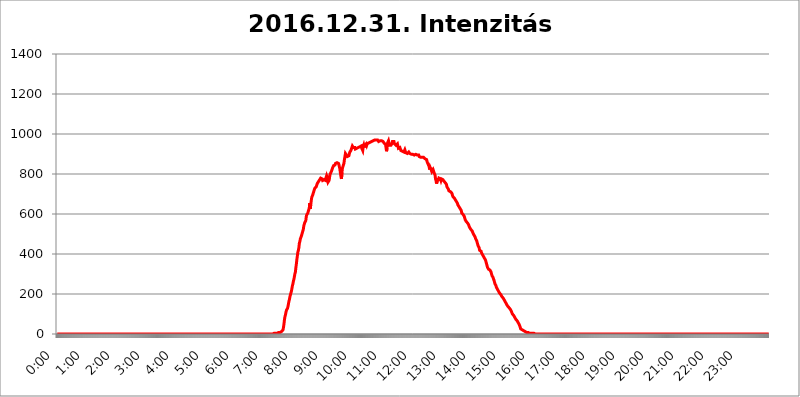
| Category | 2016.12.31. Intenzitás [W/m^2] |
|---|---|
| 0.0 | 0 |
| 0.0006944444444444445 | 0 |
| 0.001388888888888889 | 0 |
| 0.0020833333333333333 | 0 |
| 0.002777777777777778 | 0 |
| 0.003472222222222222 | 0 |
| 0.004166666666666667 | 0 |
| 0.004861111111111111 | 0 |
| 0.005555555555555556 | 0 |
| 0.0062499999999999995 | 0 |
| 0.006944444444444444 | 0 |
| 0.007638888888888889 | 0 |
| 0.008333333333333333 | 0 |
| 0.009027777777777779 | 0 |
| 0.009722222222222222 | 0 |
| 0.010416666666666666 | 0 |
| 0.011111111111111112 | 0 |
| 0.011805555555555555 | 0 |
| 0.012499999999999999 | 0 |
| 0.013194444444444444 | 0 |
| 0.013888888888888888 | 0 |
| 0.014583333333333332 | 0 |
| 0.015277777777777777 | 0 |
| 0.015972222222222224 | 0 |
| 0.016666666666666666 | 0 |
| 0.017361111111111112 | 0 |
| 0.018055555555555557 | 0 |
| 0.01875 | 0 |
| 0.019444444444444445 | 0 |
| 0.02013888888888889 | 0 |
| 0.020833333333333332 | 0 |
| 0.02152777777777778 | 0 |
| 0.022222222222222223 | 0 |
| 0.02291666666666667 | 0 |
| 0.02361111111111111 | 0 |
| 0.024305555555555556 | 0 |
| 0.024999999999999998 | 0 |
| 0.025694444444444447 | 0 |
| 0.02638888888888889 | 0 |
| 0.027083333333333334 | 0 |
| 0.027777777777777776 | 0 |
| 0.02847222222222222 | 0 |
| 0.029166666666666664 | 0 |
| 0.029861111111111113 | 0 |
| 0.030555555555555555 | 0 |
| 0.03125 | 0 |
| 0.03194444444444445 | 0 |
| 0.03263888888888889 | 0 |
| 0.03333333333333333 | 0 |
| 0.034027777777777775 | 0 |
| 0.034722222222222224 | 0 |
| 0.035416666666666666 | 0 |
| 0.036111111111111115 | 0 |
| 0.03680555555555556 | 0 |
| 0.0375 | 0 |
| 0.03819444444444444 | 0 |
| 0.03888888888888889 | 0 |
| 0.03958333333333333 | 0 |
| 0.04027777777777778 | 0 |
| 0.04097222222222222 | 0 |
| 0.041666666666666664 | 0 |
| 0.042361111111111106 | 0 |
| 0.04305555555555556 | 0 |
| 0.043750000000000004 | 0 |
| 0.044444444444444446 | 0 |
| 0.04513888888888889 | 0 |
| 0.04583333333333334 | 0 |
| 0.04652777777777778 | 0 |
| 0.04722222222222222 | 0 |
| 0.04791666666666666 | 0 |
| 0.04861111111111111 | 0 |
| 0.049305555555555554 | 0 |
| 0.049999999999999996 | 0 |
| 0.05069444444444445 | 0 |
| 0.051388888888888894 | 0 |
| 0.052083333333333336 | 0 |
| 0.05277777777777778 | 0 |
| 0.05347222222222222 | 0 |
| 0.05416666666666667 | 0 |
| 0.05486111111111111 | 0 |
| 0.05555555555555555 | 0 |
| 0.05625 | 0 |
| 0.05694444444444444 | 0 |
| 0.057638888888888885 | 0 |
| 0.05833333333333333 | 0 |
| 0.05902777777777778 | 0 |
| 0.059722222222222225 | 0 |
| 0.06041666666666667 | 0 |
| 0.061111111111111116 | 0 |
| 0.06180555555555556 | 0 |
| 0.0625 | 0 |
| 0.06319444444444444 | 0 |
| 0.06388888888888888 | 0 |
| 0.06458333333333334 | 0 |
| 0.06527777777777778 | 0 |
| 0.06597222222222222 | 0 |
| 0.06666666666666667 | 0 |
| 0.06736111111111111 | 0 |
| 0.06805555555555555 | 0 |
| 0.06874999999999999 | 0 |
| 0.06944444444444443 | 0 |
| 0.07013888888888889 | 0 |
| 0.07083333333333333 | 0 |
| 0.07152777777777779 | 0 |
| 0.07222222222222223 | 0 |
| 0.07291666666666667 | 0 |
| 0.07361111111111111 | 0 |
| 0.07430555555555556 | 0 |
| 0.075 | 0 |
| 0.07569444444444444 | 0 |
| 0.0763888888888889 | 0 |
| 0.07708333333333334 | 0 |
| 0.07777777777777778 | 0 |
| 0.07847222222222222 | 0 |
| 0.07916666666666666 | 0 |
| 0.0798611111111111 | 0 |
| 0.08055555555555556 | 0 |
| 0.08125 | 0 |
| 0.08194444444444444 | 0 |
| 0.08263888888888889 | 0 |
| 0.08333333333333333 | 0 |
| 0.08402777777777777 | 0 |
| 0.08472222222222221 | 0 |
| 0.08541666666666665 | 0 |
| 0.08611111111111112 | 0 |
| 0.08680555555555557 | 0 |
| 0.08750000000000001 | 0 |
| 0.08819444444444445 | 0 |
| 0.08888888888888889 | 0 |
| 0.08958333333333333 | 0 |
| 0.09027777777777778 | 0 |
| 0.09097222222222222 | 0 |
| 0.09166666666666667 | 0 |
| 0.09236111111111112 | 0 |
| 0.09305555555555556 | 0 |
| 0.09375 | 0 |
| 0.09444444444444444 | 0 |
| 0.09513888888888888 | 0 |
| 0.09583333333333333 | 0 |
| 0.09652777777777777 | 0 |
| 0.09722222222222222 | 0 |
| 0.09791666666666667 | 0 |
| 0.09861111111111111 | 0 |
| 0.09930555555555555 | 0 |
| 0.09999999999999999 | 0 |
| 0.10069444444444443 | 0 |
| 0.1013888888888889 | 0 |
| 0.10208333333333335 | 0 |
| 0.10277777777777779 | 0 |
| 0.10347222222222223 | 0 |
| 0.10416666666666667 | 0 |
| 0.10486111111111111 | 0 |
| 0.10555555555555556 | 0 |
| 0.10625 | 0 |
| 0.10694444444444444 | 0 |
| 0.1076388888888889 | 0 |
| 0.10833333333333334 | 0 |
| 0.10902777777777778 | 0 |
| 0.10972222222222222 | 0 |
| 0.1111111111111111 | 0 |
| 0.11180555555555556 | 0 |
| 0.11180555555555556 | 0 |
| 0.1125 | 0 |
| 0.11319444444444444 | 0 |
| 0.11388888888888889 | 0 |
| 0.11458333333333333 | 0 |
| 0.11527777777777777 | 0 |
| 0.11597222222222221 | 0 |
| 0.11666666666666665 | 0 |
| 0.1173611111111111 | 0 |
| 0.11805555555555557 | 0 |
| 0.11944444444444445 | 0 |
| 0.12013888888888889 | 0 |
| 0.12083333333333333 | 0 |
| 0.12152777777777778 | 0 |
| 0.12222222222222223 | 0 |
| 0.12291666666666667 | 0 |
| 0.12291666666666667 | 0 |
| 0.12361111111111112 | 0 |
| 0.12430555555555556 | 0 |
| 0.125 | 0 |
| 0.12569444444444444 | 0 |
| 0.12638888888888888 | 0 |
| 0.12708333333333333 | 0 |
| 0.16875 | 0 |
| 0.12847222222222224 | 0 |
| 0.12916666666666668 | 0 |
| 0.12986111111111112 | 0 |
| 0.13055555555555556 | 0 |
| 0.13125 | 0 |
| 0.13194444444444445 | 0 |
| 0.1326388888888889 | 0 |
| 0.13333333333333333 | 0 |
| 0.13402777777777777 | 0 |
| 0.13402777777777777 | 0 |
| 0.13472222222222222 | 0 |
| 0.13541666666666666 | 0 |
| 0.1361111111111111 | 0 |
| 0.13749999999999998 | 0 |
| 0.13819444444444443 | 0 |
| 0.1388888888888889 | 0 |
| 0.13958333333333334 | 0 |
| 0.14027777777777778 | 0 |
| 0.14097222222222222 | 0 |
| 0.14166666666666666 | 0 |
| 0.1423611111111111 | 0 |
| 0.14305555555555557 | 0 |
| 0.14375000000000002 | 0 |
| 0.14444444444444446 | 0 |
| 0.1451388888888889 | 0 |
| 0.1451388888888889 | 0 |
| 0.14652777777777778 | 0 |
| 0.14722222222222223 | 0 |
| 0.14791666666666667 | 0 |
| 0.1486111111111111 | 0 |
| 0.14930555555555555 | 0 |
| 0.15 | 0 |
| 0.15069444444444444 | 0 |
| 0.15138888888888888 | 0 |
| 0.15208333333333332 | 0 |
| 0.15277777777777776 | 0 |
| 0.15347222222222223 | 0 |
| 0.15416666666666667 | 0 |
| 0.15486111111111112 | 0 |
| 0.15555555555555556 | 0 |
| 0.15625 | 0 |
| 0.15694444444444444 | 0 |
| 0.15763888888888888 | 0 |
| 0.15833333333333333 | 0 |
| 0.15902777777777777 | 0 |
| 0.15972222222222224 | 0 |
| 0.16041666666666668 | 0 |
| 0.16111111111111112 | 0 |
| 0.16180555555555556 | 0 |
| 0.1625 | 0 |
| 0.16319444444444445 | 0 |
| 0.1638888888888889 | 0 |
| 0.16458333333333333 | 0 |
| 0.16527777777777777 | 0 |
| 0.16597222222222222 | 0 |
| 0.16666666666666666 | 0 |
| 0.1673611111111111 | 0 |
| 0.16805555555555554 | 0 |
| 0.16874999999999998 | 0 |
| 0.16944444444444443 | 0 |
| 0.17013888888888887 | 0 |
| 0.1708333333333333 | 0 |
| 0.17152777777777775 | 0 |
| 0.17222222222222225 | 0 |
| 0.1729166666666667 | 0 |
| 0.17361111111111113 | 0 |
| 0.17430555555555557 | 0 |
| 0.17500000000000002 | 0 |
| 0.17569444444444446 | 0 |
| 0.1763888888888889 | 0 |
| 0.17708333333333334 | 0 |
| 0.17777777777777778 | 0 |
| 0.17847222222222223 | 0 |
| 0.17916666666666667 | 0 |
| 0.1798611111111111 | 0 |
| 0.18055555555555555 | 0 |
| 0.18125 | 0 |
| 0.18194444444444444 | 0 |
| 0.1826388888888889 | 0 |
| 0.18333333333333335 | 0 |
| 0.1840277777777778 | 0 |
| 0.18472222222222223 | 0 |
| 0.18541666666666667 | 0 |
| 0.18611111111111112 | 0 |
| 0.18680555555555556 | 0 |
| 0.1875 | 0 |
| 0.18819444444444444 | 0 |
| 0.18888888888888888 | 0 |
| 0.18958333333333333 | 0 |
| 0.19027777777777777 | 0 |
| 0.1909722222222222 | 0 |
| 0.19166666666666665 | 0 |
| 0.19236111111111112 | 0 |
| 0.19305555555555554 | 0 |
| 0.19375 | 0 |
| 0.19444444444444445 | 0 |
| 0.1951388888888889 | 0 |
| 0.19583333333333333 | 0 |
| 0.19652777777777777 | 0 |
| 0.19722222222222222 | 0 |
| 0.19791666666666666 | 0 |
| 0.1986111111111111 | 0 |
| 0.19930555555555554 | 0 |
| 0.19999999999999998 | 0 |
| 0.20069444444444443 | 0 |
| 0.20138888888888887 | 0 |
| 0.2020833333333333 | 0 |
| 0.2027777777777778 | 0 |
| 0.2034722222222222 | 0 |
| 0.2041666666666667 | 0 |
| 0.20486111111111113 | 0 |
| 0.20555555555555557 | 0 |
| 0.20625000000000002 | 0 |
| 0.20694444444444446 | 0 |
| 0.2076388888888889 | 0 |
| 0.20833333333333334 | 0 |
| 0.20902777777777778 | 0 |
| 0.20972222222222223 | 0 |
| 0.21041666666666667 | 0 |
| 0.2111111111111111 | 0 |
| 0.21180555555555555 | 0 |
| 0.2125 | 0 |
| 0.21319444444444444 | 0 |
| 0.2138888888888889 | 0 |
| 0.21458333333333335 | 0 |
| 0.2152777777777778 | 0 |
| 0.21597222222222223 | 0 |
| 0.21666666666666667 | 0 |
| 0.21736111111111112 | 0 |
| 0.21805555555555556 | 0 |
| 0.21875 | 0 |
| 0.21944444444444444 | 0 |
| 0.22013888888888888 | 0 |
| 0.22083333333333333 | 0 |
| 0.22152777777777777 | 0 |
| 0.2222222222222222 | 0 |
| 0.22291666666666665 | 0 |
| 0.2236111111111111 | 0 |
| 0.22430555555555556 | 0 |
| 0.225 | 0 |
| 0.22569444444444445 | 0 |
| 0.2263888888888889 | 0 |
| 0.22708333333333333 | 0 |
| 0.22777777777777777 | 0 |
| 0.22847222222222222 | 0 |
| 0.22916666666666666 | 0 |
| 0.2298611111111111 | 0 |
| 0.23055555555555554 | 0 |
| 0.23124999999999998 | 0 |
| 0.23194444444444443 | 0 |
| 0.23263888888888887 | 0 |
| 0.2333333333333333 | 0 |
| 0.2340277777777778 | 0 |
| 0.2347222222222222 | 0 |
| 0.2354166666666667 | 0 |
| 0.23611111111111113 | 0 |
| 0.23680555555555557 | 0 |
| 0.23750000000000002 | 0 |
| 0.23819444444444446 | 0 |
| 0.2388888888888889 | 0 |
| 0.23958333333333334 | 0 |
| 0.24027777777777778 | 0 |
| 0.24097222222222223 | 0 |
| 0.24166666666666667 | 0 |
| 0.2423611111111111 | 0 |
| 0.24305555555555555 | 0 |
| 0.24375 | 0 |
| 0.24444444444444446 | 0 |
| 0.24513888888888888 | 0 |
| 0.24583333333333335 | 0 |
| 0.2465277777777778 | 0 |
| 0.24722222222222223 | 0 |
| 0.24791666666666667 | 0 |
| 0.24861111111111112 | 0 |
| 0.24930555555555556 | 0 |
| 0.25 | 0 |
| 0.25069444444444444 | 0 |
| 0.2513888888888889 | 0 |
| 0.2520833333333333 | 0 |
| 0.25277777777777777 | 0 |
| 0.2534722222222222 | 0 |
| 0.25416666666666665 | 0 |
| 0.2548611111111111 | 0 |
| 0.2555555555555556 | 0 |
| 0.25625000000000003 | 0 |
| 0.2569444444444445 | 0 |
| 0.2576388888888889 | 0 |
| 0.25833333333333336 | 0 |
| 0.2590277777777778 | 0 |
| 0.25972222222222224 | 0 |
| 0.2604166666666667 | 0 |
| 0.2611111111111111 | 0 |
| 0.26180555555555557 | 0 |
| 0.2625 | 0 |
| 0.26319444444444445 | 0 |
| 0.2638888888888889 | 0 |
| 0.26458333333333334 | 0 |
| 0.2652777777777778 | 0 |
| 0.2659722222222222 | 0 |
| 0.26666666666666666 | 0 |
| 0.2673611111111111 | 0 |
| 0.26805555555555555 | 0 |
| 0.26875 | 0 |
| 0.26944444444444443 | 0 |
| 0.2701388888888889 | 0 |
| 0.2708333333333333 | 0 |
| 0.27152777777777776 | 0 |
| 0.2722222222222222 | 0 |
| 0.27291666666666664 | 0 |
| 0.2736111111111111 | 0 |
| 0.2743055555555555 | 0 |
| 0.27499999999999997 | 0 |
| 0.27569444444444446 | 0 |
| 0.27638888888888885 | 0 |
| 0.27708333333333335 | 0 |
| 0.2777777777777778 | 0 |
| 0.27847222222222223 | 0 |
| 0.2791666666666667 | 0 |
| 0.2798611111111111 | 0 |
| 0.28055555555555556 | 0 |
| 0.28125 | 0 |
| 0.28194444444444444 | 0 |
| 0.2826388888888889 | 0 |
| 0.2833333333333333 | 0 |
| 0.28402777777777777 | 0 |
| 0.2847222222222222 | 0 |
| 0.28541666666666665 | 0 |
| 0.28611111111111115 | 0 |
| 0.28680555555555554 | 0 |
| 0.28750000000000003 | 0 |
| 0.2881944444444445 | 0 |
| 0.2888888888888889 | 0 |
| 0.28958333333333336 | 0 |
| 0.2902777777777778 | 0 |
| 0.29097222222222224 | 0 |
| 0.2916666666666667 | 0 |
| 0.2923611111111111 | 0 |
| 0.29305555555555557 | 0 |
| 0.29375 | 0 |
| 0.29444444444444445 | 0 |
| 0.2951388888888889 | 0 |
| 0.29583333333333334 | 0 |
| 0.2965277777777778 | 0 |
| 0.2972222222222222 | 0 |
| 0.29791666666666666 | 0 |
| 0.2986111111111111 | 0 |
| 0.29930555555555555 | 0 |
| 0.3 | 0 |
| 0.30069444444444443 | 0 |
| 0.3013888888888889 | 0 |
| 0.3020833333333333 | 0 |
| 0.30277777777777776 | 0 |
| 0.3034722222222222 | 0 |
| 0.30416666666666664 | 3.525 |
| 0.3048611111111111 | 3.525 |
| 0.3055555555555555 | 3.525 |
| 0.30624999999999997 | 3.525 |
| 0.3069444444444444 | 3.525 |
| 0.3076388888888889 | 3.525 |
| 0.30833333333333335 | 3.525 |
| 0.3090277777777778 | 3.525 |
| 0.30972222222222223 | 3.525 |
| 0.3104166666666667 | 7.887 |
| 0.3111111111111111 | 7.887 |
| 0.31180555555555556 | 7.887 |
| 0.3125 | 7.887 |
| 0.31319444444444444 | 7.887 |
| 0.3138888888888889 | 12.257 |
| 0.3145833333333333 | 12.257 |
| 0.31527777777777777 | 12.257 |
| 0.3159722222222222 | 16.636 |
| 0.31666666666666665 | 21.024 |
| 0.31736111111111115 | 34.234 |
| 0.31805555555555554 | 51.951 |
| 0.31875000000000003 | 74.246 |
| 0.3194444444444445 | 87.692 |
| 0.3201388888888889 | 96.682 |
| 0.32083333333333336 | 110.201 |
| 0.3215277777777778 | 119.235 |
| 0.32222222222222224 | 123.758 |
| 0.3229166666666667 | 128.284 |
| 0.3236111111111111 | 137.347 |
| 0.32430555555555557 | 150.964 |
| 0.325 | 164.605 |
| 0.32569444444444445 | 173.709 |
| 0.3263888888888889 | 187.378 |
| 0.32708333333333334 | 196.497 |
| 0.3277777777777778 | 205.62 |
| 0.3284722222222222 | 214.746 |
| 0.32916666666666666 | 228.436 |
| 0.3298611111111111 | 242.127 |
| 0.33055555555555555 | 251.251 |
| 0.33125 | 264.932 |
| 0.33194444444444443 | 274.047 |
| 0.3326388888888889 | 287.709 |
| 0.3333333333333333 | 301.354 |
| 0.3340277777777778 | 310.44 |
| 0.3347222222222222 | 333.113 |
| 0.3354166666666667 | 351.198 |
| 0.3361111111111111 | 373.729 |
| 0.3368055555555556 | 391.685 |
| 0.33749999999999997 | 409.574 |
| 0.33819444444444446 | 418.492 |
| 0.33888888888888885 | 431.833 |
| 0.33958333333333335 | 453.968 |
| 0.34027777777777773 | 462.786 |
| 0.34097222222222223 | 475.972 |
| 0.3416666666666666 | 480.356 |
| 0.3423611111111111 | 489.108 |
| 0.3430555555555555 | 493.475 |
| 0.34375 | 506.542 |
| 0.3444444444444445 | 510.885 |
| 0.3451388888888889 | 523.88 |
| 0.3458333333333334 | 541.121 |
| 0.34652777777777777 | 549.704 |
| 0.34722222222222227 | 558.261 |
| 0.34791666666666665 | 558.261 |
| 0.34861111111111115 | 566.793 |
| 0.34930555555555554 | 588.009 |
| 0.35000000000000003 | 596.45 |
| 0.3506944444444444 | 600.661 |
| 0.3513888888888889 | 604.864 |
| 0.3520833333333333 | 609.062 |
| 0.3527777777777778 | 621.613 |
| 0.3534722222222222 | 629.948 |
| 0.3541666666666667 | 654.791 |
| 0.3548611111111111 | 625.784 |
| 0.35555555555555557 | 646.537 |
| 0.35625 | 667.123 |
| 0.35694444444444445 | 683.473 |
| 0.3576388888888889 | 687.544 |
| 0.35833333333333334 | 695.666 |
| 0.3590277777777778 | 703.762 |
| 0.3597222222222222 | 711.832 |
| 0.36041666666666666 | 719.877 |
| 0.3611111111111111 | 727.896 |
| 0.36180555555555555 | 727.896 |
| 0.3625 | 727.896 |
| 0.36319444444444443 | 735.89 |
| 0.3638888888888889 | 739.877 |
| 0.3645833333333333 | 751.803 |
| 0.3652777777777778 | 755.766 |
| 0.3659722222222222 | 755.766 |
| 0.3666666666666667 | 763.674 |
| 0.3673611111111111 | 767.62 |
| 0.3680555555555556 | 771.559 |
| 0.36874999999999997 | 775.492 |
| 0.36944444444444446 | 779.42 |
| 0.37013888888888885 | 779.42 |
| 0.37083333333333335 | 783.342 |
| 0.37152777777777773 | 775.492 |
| 0.37222222222222223 | 767.62 |
| 0.3729166666666666 | 763.674 |
| 0.3736111111111111 | 767.62 |
| 0.3743055555555555 | 771.559 |
| 0.375 | 775.492 |
| 0.3756944444444445 | 767.62 |
| 0.3763888888888889 | 767.62 |
| 0.3770833333333334 | 783.342 |
| 0.37777777777777777 | 791.169 |
| 0.37847222222222227 | 787.258 |
| 0.37916666666666665 | 775.492 |
| 0.37986111111111115 | 759.723 |
| 0.38055555555555554 | 759.723 |
| 0.38125000000000003 | 767.62 |
| 0.3819444444444444 | 783.342 |
| 0.3826388888888889 | 798.974 |
| 0.3833333333333333 | 795.074 |
| 0.3840277777777778 | 802.868 |
| 0.3847222222222222 | 814.519 |
| 0.3854166666666667 | 822.26 |
| 0.3861111111111111 | 829.981 |
| 0.38680555555555557 | 833.834 |
| 0.3875 | 841.526 |
| 0.38819444444444445 | 845.365 |
| 0.3888888888888889 | 845.365 |
| 0.38958333333333334 | 845.365 |
| 0.3902777777777778 | 853.029 |
| 0.3909722222222222 | 853.029 |
| 0.39166666666666666 | 856.855 |
| 0.3923611111111111 | 856.855 |
| 0.39305555555555555 | 860.676 |
| 0.39375 | 860.676 |
| 0.39444444444444443 | 853.029 |
| 0.3951388888888889 | 845.365 |
| 0.3958333333333333 | 833.834 |
| 0.3965277777777778 | 822.26 |
| 0.3972222222222222 | 802.868 |
| 0.3979166666666667 | 787.258 |
| 0.3986111111111111 | 775.492 |
| 0.3993055555555556 | 806.757 |
| 0.39999999999999997 | 829.981 |
| 0.40069444444444446 | 833.834 |
| 0.40138888888888885 | 845.365 |
| 0.40208333333333335 | 853.029 |
| 0.40277777777777773 | 872.114 |
| 0.40347222222222223 | 887.309 |
| 0.4041666666666666 | 902.447 |
| 0.4048611111111111 | 902.447 |
| 0.4055555555555555 | 894.885 |
| 0.40625 | 894.885 |
| 0.4069444444444445 | 887.309 |
| 0.4076388888888889 | 887.309 |
| 0.4083333333333334 | 887.309 |
| 0.40902777777777777 | 891.099 |
| 0.40972222222222227 | 902.447 |
| 0.41041666666666665 | 909.996 |
| 0.41111111111111115 | 909.996 |
| 0.41180555555555554 | 917.534 |
| 0.41250000000000003 | 925.06 |
| 0.4131944444444444 | 932.576 |
| 0.4138888888888889 | 940.082 |
| 0.4145833333333333 | 936.33 |
| 0.4152777777777778 | 932.576 |
| 0.4159722222222222 | 928.819 |
| 0.4166666666666667 | 928.819 |
| 0.4173611111111111 | 932.576 |
| 0.41805555555555557 | 925.06 |
| 0.41875 | 921.298 |
| 0.41944444444444445 | 925.06 |
| 0.4201388888888889 | 928.819 |
| 0.42083333333333334 | 932.576 |
| 0.4215277777777778 | 932.576 |
| 0.4222222222222222 | 932.576 |
| 0.42291666666666666 | 936.33 |
| 0.4236111111111111 | 936.33 |
| 0.42430555555555555 | 936.33 |
| 0.425 | 940.082 |
| 0.42569444444444443 | 940.082 |
| 0.4263888888888889 | 940.082 |
| 0.4270833333333333 | 928.819 |
| 0.4277777777777778 | 928.819 |
| 0.4284722222222222 | 917.534 |
| 0.4291666666666667 | 936.33 |
| 0.4298611111111111 | 943.832 |
| 0.4305555555555556 | 932.576 |
| 0.43124999999999997 | 943.832 |
| 0.43194444444444446 | 943.832 |
| 0.43263888888888885 | 947.58 |
| 0.43333333333333335 | 951.327 |
| 0.43402777777777773 | 943.832 |
| 0.43472222222222223 | 951.327 |
| 0.4354166666666666 | 951.327 |
| 0.4361111111111111 | 951.327 |
| 0.4368055555555555 | 955.071 |
| 0.4375 | 955.071 |
| 0.4381944444444445 | 958.814 |
| 0.4388888888888889 | 958.814 |
| 0.4395833333333334 | 962.555 |
| 0.44027777777777777 | 958.814 |
| 0.44097222222222227 | 962.555 |
| 0.44166666666666665 | 958.814 |
| 0.44236111111111115 | 966.295 |
| 0.44305555555555554 | 966.295 |
| 0.44375000000000003 | 966.295 |
| 0.4444444444444444 | 966.295 |
| 0.4451388888888889 | 970.034 |
| 0.4458333333333333 | 973.772 |
| 0.4465277777777778 | 973.772 |
| 0.4472222222222222 | 970.034 |
| 0.4479166666666667 | 970.034 |
| 0.4486111111111111 | 966.295 |
| 0.44930555555555557 | 970.034 |
| 0.45 | 970.034 |
| 0.45069444444444445 | 962.555 |
| 0.4513888888888889 | 958.814 |
| 0.45208333333333334 | 962.555 |
| 0.4527777777777778 | 966.295 |
| 0.4534722222222222 | 962.555 |
| 0.45416666666666666 | 962.555 |
| 0.4548611111111111 | 966.295 |
| 0.45555555555555555 | 966.295 |
| 0.45625 | 962.555 |
| 0.45694444444444443 | 962.555 |
| 0.4576388888888889 | 958.814 |
| 0.4583333333333333 | 955.071 |
| 0.4590277777777778 | 958.814 |
| 0.4597222222222222 | 951.327 |
| 0.4604166666666667 | 947.58 |
| 0.4611111111111111 | 932.576 |
| 0.4618055555555556 | 913.766 |
| 0.46249999999999997 | 928.819 |
| 0.46319444444444446 | 955.071 |
| 0.46388888888888885 | 958.814 |
| 0.46458333333333335 | 966.295 |
| 0.46527777777777773 | 962.555 |
| 0.46597222222222223 | 943.832 |
| 0.4666666666666666 | 947.58 |
| 0.4673611111111111 | 943.832 |
| 0.4680555555555555 | 943.832 |
| 0.46875 | 943.832 |
| 0.4694444444444445 | 951.327 |
| 0.4701388888888889 | 962.555 |
| 0.4708333333333334 | 958.814 |
| 0.47152777777777777 | 966.295 |
| 0.47222222222222227 | 962.555 |
| 0.47291666666666665 | 951.327 |
| 0.47361111111111115 | 955.071 |
| 0.47430555555555554 | 955.071 |
| 0.47500000000000003 | 943.832 |
| 0.4756944444444444 | 940.082 |
| 0.4763888888888889 | 943.832 |
| 0.4770833333333333 | 951.327 |
| 0.4777777777777778 | 940.082 |
| 0.4784722222222222 | 928.819 |
| 0.4791666666666667 | 932.576 |
| 0.4798611111111111 | 932.576 |
| 0.48055555555555557 | 932.576 |
| 0.48125 | 925.06 |
| 0.48194444444444445 | 917.534 |
| 0.4826388888888889 | 917.534 |
| 0.48333333333333334 | 921.298 |
| 0.4840277777777778 | 913.766 |
| 0.4847222222222222 | 909.996 |
| 0.48541666666666666 | 913.766 |
| 0.4861111111111111 | 909.996 |
| 0.48680555555555555 | 909.996 |
| 0.4875 | 921.298 |
| 0.48819444444444443 | 913.766 |
| 0.4888888888888889 | 906.223 |
| 0.4895833333333333 | 909.996 |
| 0.4902777777777778 | 906.223 |
| 0.4909722222222222 | 902.447 |
| 0.4916666666666667 | 902.447 |
| 0.4923611111111111 | 906.223 |
| 0.4930555555555556 | 909.996 |
| 0.49374999999999997 | 909.996 |
| 0.49444444444444446 | 902.447 |
| 0.49513888888888885 | 902.447 |
| 0.49583333333333335 | 902.447 |
| 0.49652777777777773 | 898.668 |
| 0.49722222222222223 | 898.668 |
| 0.4979166666666666 | 898.668 |
| 0.4986111111111111 | 898.668 |
| 0.4993055555555555 | 898.668 |
| 0.5 | 894.885 |
| 0.5006944444444444 | 894.885 |
| 0.5013888888888889 | 894.885 |
| 0.5020833333333333 | 894.885 |
| 0.5027777777777778 | 898.668 |
| 0.5034722222222222 | 894.885 |
| 0.5041666666666667 | 894.885 |
| 0.5048611111111111 | 894.885 |
| 0.5055555555555555 | 894.885 |
| 0.50625 | 894.885 |
| 0.5069444444444444 | 894.885 |
| 0.5076388888888889 | 887.309 |
| 0.5083333333333333 | 887.309 |
| 0.5090277777777777 | 883.516 |
| 0.5097222222222222 | 883.516 |
| 0.5104166666666666 | 883.516 |
| 0.5111111111111112 | 883.516 |
| 0.5118055555555555 | 883.516 |
| 0.5125000000000001 | 879.719 |
| 0.5131944444444444 | 883.516 |
| 0.513888888888889 | 883.516 |
| 0.5145833333333333 | 879.719 |
| 0.5152777777777778 | 879.719 |
| 0.5159722222222222 | 875.918 |
| 0.5166666666666667 | 872.114 |
| 0.517361111111111 | 872.114 |
| 0.5180555555555556 | 872.114 |
| 0.5187499999999999 | 860.676 |
| 0.5194444444444445 | 860.676 |
| 0.5201388888888888 | 849.199 |
| 0.5208333333333334 | 853.029 |
| 0.5215277777777778 | 837.682 |
| 0.5222222222222223 | 822.26 |
| 0.5229166666666667 | 833.834 |
| 0.5236111111111111 | 829.981 |
| 0.5243055555555556 | 822.26 |
| 0.525 | 829.981 |
| 0.5256944444444445 | 814.519 |
| 0.5263888888888889 | 810.641 |
| 0.5270833333333333 | 822.26 |
| 0.5277777777777778 | 818.392 |
| 0.5284722222222222 | 806.757 |
| 0.5291666666666667 | 806.757 |
| 0.5298611111111111 | 795.074 |
| 0.5305555555555556 | 775.492 |
| 0.53125 | 767.62 |
| 0.5319444444444444 | 751.803 |
| 0.5326388888888889 | 755.766 |
| 0.5333333333333333 | 771.559 |
| 0.5340277777777778 | 779.42 |
| 0.5347222222222222 | 767.62 |
| 0.5354166666666667 | 779.42 |
| 0.5361111111111111 | 783.342 |
| 0.5368055555555555 | 783.342 |
| 0.5375 | 775.492 |
| 0.5381944444444444 | 767.62 |
| 0.5388888888888889 | 775.492 |
| 0.5395833333333333 | 775.492 |
| 0.5402777777777777 | 775.492 |
| 0.5409722222222222 | 771.559 |
| 0.5416666666666666 | 771.559 |
| 0.5423611111111112 | 763.674 |
| 0.5430555555555555 | 763.674 |
| 0.5437500000000001 | 763.674 |
| 0.5444444444444444 | 755.766 |
| 0.545138888888889 | 755.766 |
| 0.5458333333333333 | 747.834 |
| 0.5465277777777778 | 735.89 |
| 0.5472222222222222 | 735.89 |
| 0.5479166666666667 | 735.89 |
| 0.548611111111111 | 723.889 |
| 0.5493055555555556 | 715.858 |
| 0.5499999999999999 | 711.832 |
| 0.5506944444444445 | 711.832 |
| 0.5513888888888888 | 711.832 |
| 0.5520833333333334 | 707.8 |
| 0.5527777777777778 | 707.8 |
| 0.5534722222222223 | 703.762 |
| 0.5541666666666667 | 695.666 |
| 0.5548611111111111 | 687.544 |
| 0.5555555555555556 | 691.608 |
| 0.55625 | 683.473 |
| 0.5569444444444445 | 679.395 |
| 0.5576388888888889 | 675.311 |
| 0.5583333333333333 | 675.311 |
| 0.5590277777777778 | 667.123 |
| 0.5597222222222222 | 663.019 |
| 0.5604166666666667 | 663.019 |
| 0.5611111111111111 | 654.791 |
| 0.5618055555555556 | 646.537 |
| 0.5625 | 642.4 |
| 0.5631944444444444 | 642.4 |
| 0.5638888888888889 | 634.105 |
| 0.5645833333333333 | 629.948 |
| 0.5652777777777778 | 625.784 |
| 0.5659722222222222 | 621.613 |
| 0.5666666666666667 | 617.436 |
| 0.5673611111111111 | 604.864 |
| 0.5680555555555555 | 600.661 |
| 0.56875 | 604.864 |
| 0.5694444444444444 | 596.45 |
| 0.5701388888888889 | 592.233 |
| 0.5708333333333333 | 588.009 |
| 0.5715277777777777 | 579.542 |
| 0.5722222222222222 | 571.049 |
| 0.5729166666666666 | 566.793 |
| 0.5736111111111112 | 562.53 |
| 0.5743055555555555 | 558.261 |
| 0.5750000000000001 | 558.261 |
| 0.5756944444444444 | 553.986 |
| 0.576388888888889 | 549.704 |
| 0.5770833333333333 | 545.416 |
| 0.5777777777777778 | 536.82 |
| 0.5784722222222222 | 532.513 |
| 0.5791666666666667 | 532.513 |
| 0.579861111111111 | 523.88 |
| 0.5805555555555556 | 523.88 |
| 0.5812499999999999 | 519.555 |
| 0.5819444444444445 | 515.223 |
| 0.5826388888888888 | 510.885 |
| 0.5833333333333334 | 502.192 |
| 0.5840277777777778 | 497.836 |
| 0.5847222222222223 | 493.475 |
| 0.5854166666666667 | 489.108 |
| 0.5861111111111111 | 484.735 |
| 0.5868055555555556 | 475.972 |
| 0.5875 | 471.582 |
| 0.5881944444444445 | 467.187 |
| 0.5888888888888889 | 462.786 |
| 0.5895833333333333 | 449.551 |
| 0.5902777777777778 | 440.702 |
| 0.5909722222222222 | 436.27 |
| 0.5916666666666667 | 431.833 |
| 0.5923611111111111 | 418.492 |
| 0.5930555555555556 | 418.492 |
| 0.59375 | 418.492 |
| 0.5944444444444444 | 414.035 |
| 0.5951388888888889 | 405.108 |
| 0.5958333333333333 | 405.108 |
| 0.5965277777777778 | 396.164 |
| 0.5972222222222222 | 391.685 |
| 0.5979166666666667 | 391.685 |
| 0.5986111111111111 | 382.715 |
| 0.5993055555555555 | 387.202 |
| 0.6 | 382.715 |
| 0.6006944444444444 | 369.23 |
| 0.6013888888888889 | 360.221 |
| 0.6020833333333333 | 351.198 |
| 0.6027777777777777 | 342.162 |
| 0.6034722222222222 | 333.113 |
| 0.6041666666666666 | 328.584 |
| 0.6048611111111112 | 324.052 |
| 0.6055555555555555 | 324.052 |
| 0.6062500000000001 | 324.052 |
| 0.6069444444444444 | 319.517 |
| 0.607638888888889 | 314.98 |
| 0.6083333333333333 | 310.44 |
| 0.6090277777777778 | 301.354 |
| 0.6097222222222222 | 292.259 |
| 0.6104166666666667 | 287.709 |
| 0.611111111111111 | 283.156 |
| 0.6118055555555556 | 278.603 |
| 0.6124999999999999 | 269.49 |
| 0.6131944444444445 | 260.373 |
| 0.6138888888888888 | 251.251 |
| 0.6145833333333334 | 246.689 |
| 0.6152777777777778 | 242.127 |
| 0.6159722222222223 | 233 |
| 0.6166666666666667 | 228.436 |
| 0.6173611111111111 | 223.873 |
| 0.6180555555555556 | 223.873 |
| 0.61875 | 214.746 |
| 0.6194444444444445 | 210.182 |
| 0.6201388888888889 | 205.62 |
| 0.6208333333333333 | 201.058 |
| 0.6215277777777778 | 201.058 |
| 0.6222222222222222 | 196.497 |
| 0.6229166666666667 | 191.937 |
| 0.6236111111111111 | 187.378 |
| 0.6243055555555556 | 182.82 |
| 0.625 | 182.82 |
| 0.6256944444444444 | 178.264 |
| 0.6263888888888889 | 173.709 |
| 0.6270833333333333 | 169.156 |
| 0.6277777777777778 | 164.605 |
| 0.6284722222222222 | 160.056 |
| 0.6291666666666667 | 155.509 |
| 0.6298611111111111 | 150.964 |
| 0.6305555555555555 | 146.423 |
| 0.63125 | 141.884 |
| 0.6319444444444444 | 137.347 |
| 0.6326388888888889 | 137.347 |
| 0.6333333333333333 | 132.814 |
| 0.6340277777777777 | 128.284 |
| 0.6347222222222222 | 128.284 |
| 0.6354166666666666 | 123.758 |
| 0.6361111111111112 | 119.235 |
| 0.6368055555555555 | 114.716 |
| 0.6375000000000001 | 110.201 |
| 0.6381944444444444 | 101.184 |
| 0.638888888888889 | 101.184 |
| 0.6395833333333333 | 96.682 |
| 0.6402777777777778 | 92.184 |
| 0.6409722222222222 | 87.692 |
| 0.6416666666666667 | 83.205 |
| 0.642361111111111 | 78.722 |
| 0.6430555555555556 | 74.246 |
| 0.6437499999999999 | 74.246 |
| 0.6444444444444445 | 69.775 |
| 0.6451388888888888 | 65.31 |
| 0.6458333333333334 | 60.85 |
| 0.6465277777777778 | 56.398 |
| 0.6472222222222223 | 51.951 |
| 0.6479166666666667 | 47.511 |
| 0.6486111111111111 | 43.079 |
| 0.6493055555555556 | 34.234 |
| 0.65 | 25.419 |
| 0.6506944444444445 | 21.024 |
| 0.6513888888888889 | 21.024 |
| 0.6520833333333333 | 21.024 |
| 0.6527777777777778 | 21.024 |
| 0.6534722222222222 | 16.636 |
| 0.6541666666666667 | 16.636 |
| 0.6548611111111111 | 16.636 |
| 0.6555555555555556 | 12.257 |
| 0.65625 | 12.257 |
| 0.6569444444444444 | 12.257 |
| 0.6576388888888889 | 7.887 |
| 0.6583333333333333 | 7.887 |
| 0.6590277777777778 | 7.887 |
| 0.6597222222222222 | 7.887 |
| 0.6604166666666667 | 7.887 |
| 0.6611111111111111 | 7.887 |
| 0.6618055555555555 | 3.525 |
| 0.6625 | 3.525 |
| 0.6631944444444444 | 3.525 |
| 0.6638888888888889 | 3.525 |
| 0.6645833333333333 | 3.525 |
| 0.6652777777777777 | 3.525 |
| 0.6659722222222222 | 3.525 |
| 0.6666666666666666 | 3.525 |
| 0.6673611111111111 | 3.525 |
| 0.6680555555555556 | 3.525 |
| 0.6687500000000001 | 3.525 |
| 0.6694444444444444 | 3.525 |
| 0.6701388888888888 | 0 |
| 0.6708333333333334 | 0 |
| 0.6715277777777778 | 0 |
| 0.6722222222222222 | 0 |
| 0.6729166666666666 | 0 |
| 0.6736111111111112 | 0 |
| 0.6743055555555556 | 0 |
| 0.6749999999999999 | 0 |
| 0.6756944444444444 | 0 |
| 0.6763888888888889 | 0 |
| 0.6770833333333334 | 0 |
| 0.6777777777777777 | 0 |
| 0.6784722222222223 | 0 |
| 0.6791666666666667 | 0 |
| 0.6798611111111111 | 0 |
| 0.6805555555555555 | 0 |
| 0.68125 | 0 |
| 0.6819444444444445 | 0 |
| 0.6826388888888889 | 0 |
| 0.6833333333333332 | 0 |
| 0.6840277777777778 | 0 |
| 0.6847222222222222 | 0 |
| 0.6854166666666667 | 0 |
| 0.686111111111111 | 0 |
| 0.6868055555555556 | 0 |
| 0.6875 | 0 |
| 0.6881944444444444 | 0 |
| 0.688888888888889 | 0 |
| 0.6895833333333333 | 0 |
| 0.6902777777777778 | 0 |
| 0.6909722222222222 | 0 |
| 0.6916666666666668 | 0 |
| 0.6923611111111111 | 0 |
| 0.6930555555555555 | 0 |
| 0.69375 | 0 |
| 0.6944444444444445 | 0 |
| 0.6951388888888889 | 0 |
| 0.6958333333333333 | 0 |
| 0.6965277777777777 | 0 |
| 0.6972222222222223 | 0 |
| 0.6979166666666666 | 0 |
| 0.6986111111111111 | 0 |
| 0.6993055555555556 | 0 |
| 0.7000000000000001 | 0 |
| 0.7006944444444444 | 0 |
| 0.7013888888888888 | 0 |
| 0.7020833333333334 | 0 |
| 0.7027777777777778 | 0 |
| 0.7034722222222222 | 0 |
| 0.7041666666666666 | 0 |
| 0.7048611111111112 | 0 |
| 0.7055555555555556 | 0 |
| 0.7062499999999999 | 0 |
| 0.7069444444444444 | 0 |
| 0.7076388888888889 | 0 |
| 0.7083333333333334 | 0 |
| 0.7090277777777777 | 0 |
| 0.7097222222222223 | 0 |
| 0.7104166666666667 | 0 |
| 0.7111111111111111 | 0 |
| 0.7118055555555555 | 0 |
| 0.7125 | 0 |
| 0.7131944444444445 | 0 |
| 0.7138888888888889 | 0 |
| 0.7145833333333332 | 0 |
| 0.7152777777777778 | 0 |
| 0.7159722222222222 | 0 |
| 0.7166666666666667 | 0 |
| 0.717361111111111 | 0 |
| 0.7180555555555556 | 0 |
| 0.71875 | 0 |
| 0.7194444444444444 | 0 |
| 0.720138888888889 | 0 |
| 0.7208333333333333 | 0 |
| 0.7215277777777778 | 0 |
| 0.7222222222222222 | 0 |
| 0.7229166666666668 | 0 |
| 0.7236111111111111 | 0 |
| 0.7243055555555555 | 0 |
| 0.725 | 0 |
| 0.7256944444444445 | 0 |
| 0.7263888888888889 | 0 |
| 0.7270833333333333 | 0 |
| 0.7277777777777777 | 0 |
| 0.7284722222222223 | 0 |
| 0.7291666666666666 | 0 |
| 0.7298611111111111 | 0 |
| 0.7305555555555556 | 0 |
| 0.7312500000000001 | 0 |
| 0.7319444444444444 | 0 |
| 0.7326388888888888 | 0 |
| 0.7333333333333334 | 0 |
| 0.7340277777777778 | 0 |
| 0.7347222222222222 | 0 |
| 0.7354166666666666 | 0 |
| 0.7361111111111112 | 0 |
| 0.7368055555555556 | 0 |
| 0.7374999999999999 | 0 |
| 0.7381944444444444 | 0 |
| 0.7388888888888889 | 0 |
| 0.7395833333333334 | 0 |
| 0.7402777777777777 | 0 |
| 0.7409722222222223 | 0 |
| 0.7416666666666667 | 0 |
| 0.7423611111111111 | 0 |
| 0.7430555555555555 | 0 |
| 0.74375 | 0 |
| 0.7444444444444445 | 0 |
| 0.7451388888888889 | 0 |
| 0.7458333333333332 | 0 |
| 0.7465277777777778 | 0 |
| 0.7472222222222222 | 0 |
| 0.7479166666666667 | 0 |
| 0.748611111111111 | 0 |
| 0.7493055555555556 | 0 |
| 0.75 | 0 |
| 0.7506944444444444 | 0 |
| 0.751388888888889 | 0 |
| 0.7520833333333333 | 0 |
| 0.7527777777777778 | 0 |
| 0.7534722222222222 | 0 |
| 0.7541666666666668 | 0 |
| 0.7548611111111111 | 0 |
| 0.7555555555555555 | 0 |
| 0.75625 | 0 |
| 0.7569444444444445 | 0 |
| 0.7576388888888889 | 0 |
| 0.7583333333333333 | 0 |
| 0.7590277777777777 | 0 |
| 0.7597222222222223 | 0 |
| 0.7604166666666666 | 0 |
| 0.7611111111111111 | 0 |
| 0.7618055555555556 | 0 |
| 0.7625000000000001 | 0 |
| 0.7631944444444444 | 0 |
| 0.7638888888888888 | 0 |
| 0.7645833333333334 | 0 |
| 0.7652777777777778 | 0 |
| 0.7659722222222222 | 0 |
| 0.7666666666666666 | 0 |
| 0.7673611111111112 | 0 |
| 0.7680555555555556 | 0 |
| 0.7687499999999999 | 0 |
| 0.7694444444444444 | 0 |
| 0.7701388888888889 | 0 |
| 0.7708333333333334 | 0 |
| 0.7715277777777777 | 0 |
| 0.7722222222222223 | 0 |
| 0.7729166666666667 | 0 |
| 0.7736111111111111 | 0 |
| 0.7743055555555555 | 0 |
| 0.775 | 0 |
| 0.7756944444444445 | 0 |
| 0.7763888888888889 | 0 |
| 0.7770833333333332 | 0 |
| 0.7777777777777778 | 0 |
| 0.7784722222222222 | 0 |
| 0.7791666666666667 | 0 |
| 0.779861111111111 | 0 |
| 0.7805555555555556 | 0 |
| 0.78125 | 0 |
| 0.7819444444444444 | 0 |
| 0.782638888888889 | 0 |
| 0.7833333333333333 | 0 |
| 0.7840277777777778 | 0 |
| 0.7847222222222222 | 0 |
| 0.7854166666666668 | 0 |
| 0.7861111111111111 | 0 |
| 0.7868055555555555 | 0 |
| 0.7875 | 0 |
| 0.7881944444444445 | 0 |
| 0.7888888888888889 | 0 |
| 0.7895833333333333 | 0 |
| 0.7902777777777777 | 0 |
| 0.7909722222222223 | 0 |
| 0.7916666666666666 | 0 |
| 0.7923611111111111 | 0 |
| 0.7930555555555556 | 0 |
| 0.7937500000000001 | 0 |
| 0.7944444444444444 | 0 |
| 0.7951388888888888 | 0 |
| 0.7958333333333334 | 0 |
| 0.7965277777777778 | 0 |
| 0.7972222222222222 | 0 |
| 0.7979166666666666 | 0 |
| 0.7986111111111112 | 0 |
| 0.7993055555555556 | 0 |
| 0.7999999999999999 | 0 |
| 0.8006944444444444 | 0 |
| 0.8013888888888889 | 0 |
| 0.8020833333333334 | 0 |
| 0.8027777777777777 | 0 |
| 0.8034722222222223 | 0 |
| 0.8041666666666667 | 0 |
| 0.8048611111111111 | 0 |
| 0.8055555555555555 | 0 |
| 0.80625 | 0 |
| 0.8069444444444445 | 0 |
| 0.8076388888888889 | 0 |
| 0.8083333333333332 | 0 |
| 0.8090277777777778 | 0 |
| 0.8097222222222222 | 0 |
| 0.8104166666666667 | 0 |
| 0.811111111111111 | 0 |
| 0.8118055555555556 | 0 |
| 0.8125 | 0 |
| 0.8131944444444444 | 0 |
| 0.813888888888889 | 0 |
| 0.8145833333333333 | 0 |
| 0.8152777777777778 | 0 |
| 0.8159722222222222 | 0 |
| 0.8166666666666668 | 0 |
| 0.8173611111111111 | 0 |
| 0.8180555555555555 | 0 |
| 0.81875 | 0 |
| 0.8194444444444445 | 0 |
| 0.8201388888888889 | 0 |
| 0.8208333333333333 | 0 |
| 0.8215277777777777 | 0 |
| 0.8222222222222223 | 0 |
| 0.8229166666666666 | 0 |
| 0.8236111111111111 | 0 |
| 0.8243055555555556 | 0 |
| 0.8250000000000001 | 0 |
| 0.8256944444444444 | 0 |
| 0.8263888888888888 | 0 |
| 0.8270833333333334 | 0 |
| 0.8277777777777778 | 0 |
| 0.8284722222222222 | 0 |
| 0.8291666666666666 | 0 |
| 0.8298611111111112 | 0 |
| 0.8305555555555556 | 0 |
| 0.8312499999999999 | 0 |
| 0.8319444444444444 | 0 |
| 0.8326388888888889 | 0 |
| 0.8333333333333334 | 0 |
| 0.8340277777777777 | 0 |
| 0.8347222222222223 | 0 |
| 0.8354166666666667 | 0 |
| 0.8361111111111111 | 0 |
| 0.8368055555555555 | 0 |
| 0.8375 | 0 |
| 0.8381944444444445 | 0 |
| 0.8388888888888889 | 0 |
| 0.8395833333333332 | 0 |
| 0.8402777777777778 | 0 |
| 0.8409722222222222 | 0 |
| 0.8416666666666667 | 0 |
| 0.842361111111111 | 0 |
| 0.8430555555555556 | 0 |
| 0.84375 | 0 |
| 0.8444444444444444 | 0 |
| 0.845138888888889 | 0 |
| 0.8458333333333333 | 0 |
| 0.8465277777777778 | 0 |
| 0.8472222222222222 | 0 |
| 0.8479166666666668 | 0 |
| 0.8486111111111111 | 0 |
| 0.8493055555555555 | 0 |
| 0.85 | 0 |
| 0.8506944444444445 | 0 |
| 0.8513888888888889 | 0 |
| 0.8520833333333333 | 0 |
| 0.8527777777777777 | 0 |
| 0.8534722222222223 | 0 |
| 0.8541666666666666 | 0 |
| 0.8548611111111111 | 0 |
| 0.8555555555555556 | 0 |
| 0.8562500000000001 | 0 |
| 0.8569444444444444 | 0 |
| 0.8576388888888888 | 0 |
| 0.8583333333333334 | 0 |
| 0.8590277777777778 | 0 |
| 0.8597222222222222 | 0 |
| 0.8604166666666666 | 0 |
| 0.8611111111111112 | 0 |
| 0.8618055555555556 | 0 |
| 0.8624999999999999 | 0 |
| 0.8631944444444444 | 0 |
| 0.8638888888888889 | 0 |
| 0.8645833333333334 | 0 |
| 0.8652777777777777 | 0 |
| 0.8659722222222223 | 0 |
| 0.8666666666666667 | 0 |
| 0.8673611111111111 | 0 |
| 0.8680555555555555 | 0 |
| 0.86875 | 0 |
| 0.8694444444444445 | 0 |
| 0.8701388888888889 | 0 |
| 0.8708333333333332 | 0 |
| 0.8715277777777778 | 0 |
| 0.8722222222222222 | 0 |
| 0.8729166666666667 | 0 |
| 0.873611111111111 | 0 |
| 0.8743055555555556 | 0 |
| 0.875 | 0 |
| 0.8756944444444444 | 0 |
| 0.876388888888889 | 0 |
| 0.8770833333333333 | 0 |
| 0.8777777777777778 | 0 |
| 0.8784722222222222 | 0 |
| 0.8791666666666668 | 0 |
| 0.8798611111111111 | 0 |
| 0.8805555555555555 | 0 |
| 0.88125 | 0 |
| 0.8819444444444445 | 0 |
| 0.8826388888888889 | 0 |
| 0.8833333333333333 | 0 |
| 0.8840277777777777 | 0 |
| 0.8847222222222223 | 0 |
| 0.8854166666666666 | 0 |
| 0.8861111111111111 | 0 |
| 0.8868055555555556 | 0 |
| 0.8875000000000001 | 0 |
| 0.8881944444444444 | 0 |
| 0.8888888888888888 | 0 |
| 0.8895833333333334 | 0 |
| 0.8902777777777778 | 0 |
| 0.8909722222222222 | 0 |
| 0.8916666666666666 | 0 |
| 0.8923611111111112 | 0 |
| 0.8930555555555556 | 0 |
| 0.8937499999999999 | 0 |
| 0.8944444444444444 | 0 |
| 0.8951388888888889 | 0 |
| 0.8958333333333334 | 0 |
| 0.8965277777777777 | 0 |
| 0.8972222222222223 | 0 |
| 0.8979166666666667 | 0 |
| 0.8986111111111111 | 0 |
| 0.8993055555555555 | 0 |
| 0.9 | 0 |
| 0.9006944444444445 | 0 |
| 0.9013888888888889 | 0 |
| 0.9020833333333332 | 0 |
| 0.9027777777777778 | 0 |
| 0.9034722222222222 | 0 |
| 0.9041666666666667 | 0 |
| 0.904861111111111 | 0 |
| 0.9055555555555556 | 0 |
| 0.90625 | 0 |
| 0.9069444444444444 | 0 |
| 0.907638888888889 | 0 |
| 0.9083333333333333 | 0 |
| 0.9090277777777778 | 0 |
| 0.9097222222222222 | 0 |
| 0.9104166666666668 | 0 |
| 0.9111111111111111 | 0 |
| 0.9118055555555555 | 0 |
| 0.9125 | 0 |
| 0.9131944444444445 | 0 |
| 0.9138888888888889 | 0 |
| 0.9145833333333333 | 0 |
| 0.9152777777777777 | 0 |
| 0.9159722222222223 | 0 |
| 0.9166666666666666 | 0 |
| 0.9173611111111111 | 0 |
| 0.9180555555555556 | 0 |
| 0.9187500000000001 | 0 |
| 0.9194444444444444 | 0 |
| 0.9201388888888888 | 0 |
| 0.9208333333333334 | 0 |
| 0.9215277777777778 | 0 |
| 0.9222222222222222 | 0 |
| 0.9229166666666666 | 0 |
| 0.9236111111111112 | 0 |
| 0.9243055555555556 | 0 |
| 0.9249999999999999 | 0 |
| 0.9256944444444444 | 0 |
| 0.9263888888888889 | 0 |
| 0.9270833333333334 | 0 |
| 0.9277777777777777 | 0 |
| 0.9284722222222223 | 0 |
| 0.9291666666666667 | 0 |
| 0.9298611111111111 | 0 |
| 0.9305555555555555 | 0 |
| 0.93125 | 0 |
| 0.9319444444444445 | 0 |
| 0.9326388888888889 | 0 |
| 0.9333333333333332 | 0 |
| 0.9340277777777778 | 0 |
| 0.9347222222222222 | 0 |
| 0.9354166666666667 | 0 |
| 0.936111111111111 | 0 |
| 0.9368055555555556 | 0 |
| 0.9375 | 0 |
| 0.9381944444444444 | 0 |
| 0.938888888888889 | 0 |
| 0.9395833333333333 | 0 |
| 0.9402777777777778 | 0 |
| 0.9409722222222222 | 0 |
| 0.9416666666666668 | 0 |
| 0.9423611111111111 | 0 |
| 0.9430555555555555 | 0 |
| 0.94375 | 0 |
| 0.9444444444444445 | 0 |
| 0.9451388888888889 | 0 |
| 0.9458333333333333 | 0 |
| 0.9465277777777777 | 0 |
| 0.9472222222222223 | 0 |
| 0.9479166666666666 | 0 |
| 0.9486111111111111 | 0 |
| 0.9493055555555556 | 0 |
| 0.9500000000000001 | 0 |
| 0.9506944444444444 | 0 |
| 0.9513888888888888 | 0 |
| 0.9520833333333334 | 0 |
| 0.9527777777777778 | 0 |
| 0.9534722222222222 | 0 |
| 0.9541666666666666 | 0 |
| 0.9548611111111112 | 0 |
| 0.9555555555555556 | 0 |
| 0.9562499999999999 | 0 |
| 0.9569444444444444 | 0 |
| 0.9576388888888889 | 0 |
| 0.9583333333333334 | 0 |
| 0.9590277777777777 | 0 |
| 0.9597222222222223 | 0 |
| 0.9604166666666667 | 0 |
| 0.9611111111111111 | 0 |
| 0.9618055555555555 | 0 |
| 0.9625 | 0 |
| 0.9631944444444445 | 0 |
| 0.9638888888888889 | 0 |
| 0.9645833333333332 | 0 |
| 0.9652777777777778 | 0 |
| 0.9659722222222222 | 0 |
| 0.9666666666666667 | 0 |
| 0.967361111111111 | 0 |
| 0.9680555555555556 | 0 |
| 0.96875 | 0 |
| 0.9694444444444444 | 0 |
| 0.970138888888889 | 0 |
| 0.9708333333333333 | 0 |
| 0.9715277777777778 | 0 |
| 0.9722222222222222 | 0 |
| 0.9729166666666668 | 0 |
| 0.9736111111111111 | 0 |
| 0.9743055555555555 | 0 |
| 0.975 | 0 |
| 0.9756944444444445 | 0 |
| 0.9763888888888889 | 0 |
| 0.9770833333333333 | 0 |
| 0.9777777777777777 | 0 |
| 0.9784722222222223 | 0 |
| 0.9791666666666666 | 0 |
| 0.9798611111111111 | 0 |
| 0.9805555555555556 | 0 |
| 0.9812500000000001 | 0 |
| 0.9819444444444444 | 0 |
| 0.9826388888888888 | 0 |
| 0.9833333333333334 | 0 |
| 0.9840277777777778 | 0 |
| 0.9847222222222222 | 0 |
| 0.9854166666666666 | 0 |
| 0.9861111111111112 | 0 |
| 0.9868055555555556 | 0 |
| 0.9874999999999999 | 0 |
| 0.9881944444444444 | 0 |
| 0.9888888888888889 | 0 |
| 0.9895833333333334 | 0 |
| 0.9902777777777777 | 0 |
| 0.9909722222222223 | 0 |
| 0.9916666666666667 | 0 |
| 0.9923611111111111 | 0 |
| 0.9930555555555555 | 0 |
| 0.99375 | 0 |
| 0.9944444444444445 | 0 |
| 0.9951388888888889 | 0 |
| 0.9958333333333332 | 0 |
| 0.9965277777777778 | 0 |
| 0.9972222222222222 | 0 |
| 0.9979166666666667 | 0 |
| 0.998611111111111 | 0 |
| 0.9993055555555556 | 0 |